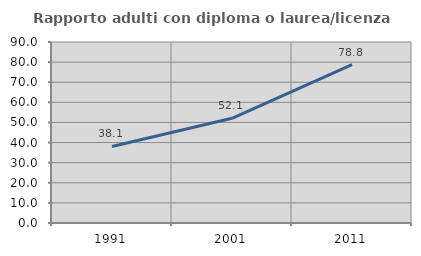
| Category | Rapporto adulti con diploma o laurea/licenza media  |
|---|---|
| 1991.0 | 38.069 |
| 2001.0 | 52.075 |
| 2011.0 | 78.803 |